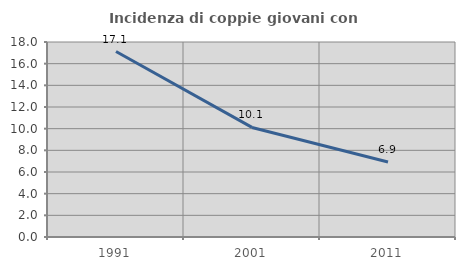
| Category | Incidenza di coppie giovani con figli |
|---|---|
| 1991.0 | 17.118 |
| 2001.0 | 10.115 |
| 2011.0 | 6.918 |